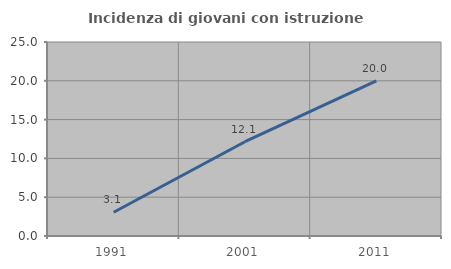
| Category | Incidenza di giovani con istruzione universitaria |
|---|---|
| 1991.0 | 3.061 |
| 2001.0 | 12.15 |
| 2011.0 | 20 |